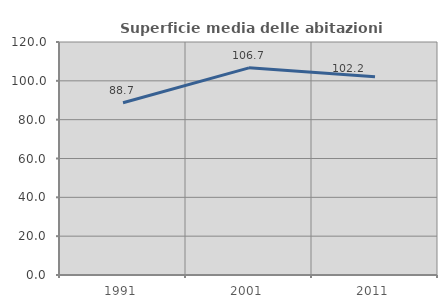
| Category | Superficie media delle abitazioni occupate |
|---|---|
| 1991.0 | 88.716 |
| 2001.0 | 106.692 |
| 2011.0 | 102.163 |